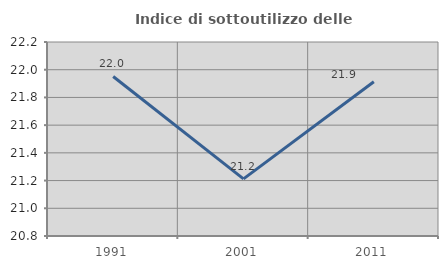
| Category | Indice di sottoutilizzo delle abitazioni  |
|---|---|
| 1991.0 | 21.951 |
| 2001.0 | 21.212 |
| 2011.0 | 21.914 |